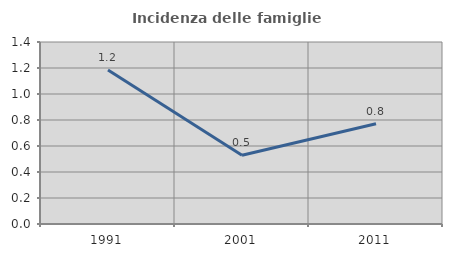
| Category | Incidenza delle famiglie numerose |
|---|---|
| 1991.0 | 1.185 |
| 2001.0 | 0.529 |
| 2011.0 | 0.772 |